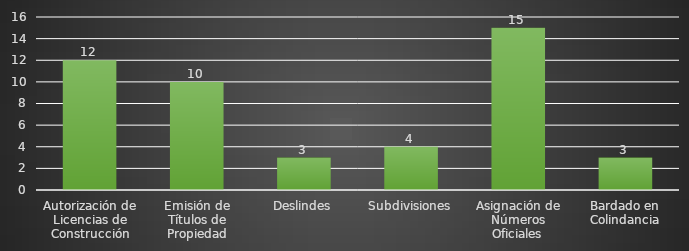
| Category | INDICADOR  |
|---|---|
| Autorización de Licencias de Construcción | 12 |
| Emisión de Títulos de Propiedad | 10 |
| Deslindes | 3 |
| Subdivisiones | 4 |
| Asignación de Números Oficiales | 15 |
| Bardado en Colindancia | 3 |